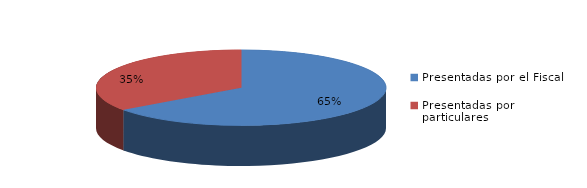
| Category | Series 0 |
|---|---|
| Presentadas por el Fiscal | 208 |
| Presentadas por particulares | 112 |